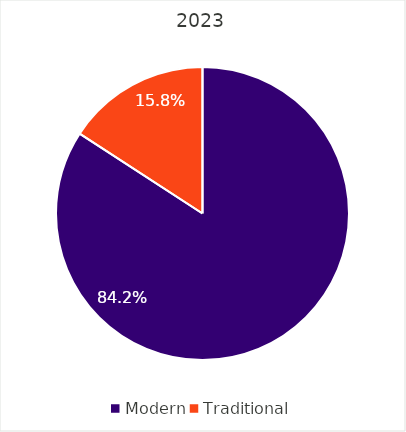
| Category | Series 0 |
|---|---|
| Modern | 0.842 |
| Traditional | 0.158 |